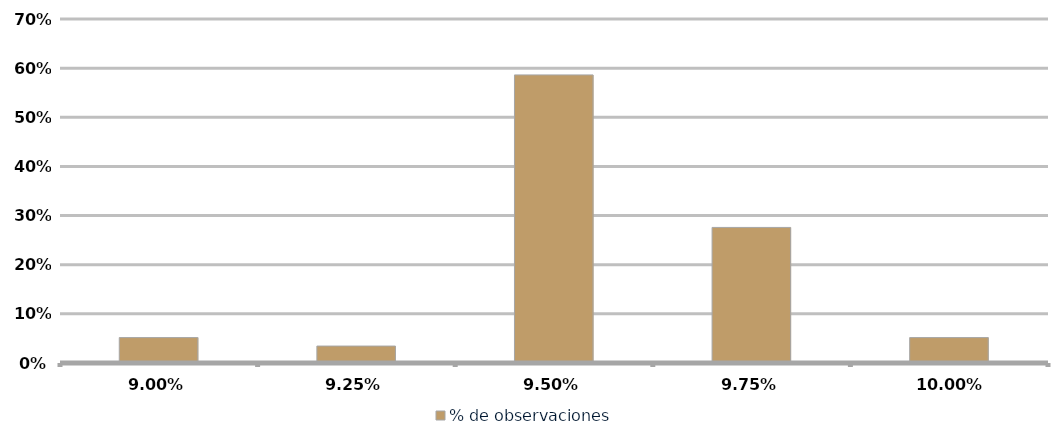
| Category | % de observaciones  |
|---|---|
| 0.09 | 0.052 |
| 0.0925 | 0.034 |
| 0.095 | 0.586 |
| 0.0975 | 0.276 |
| 0.1 | 0.052 |